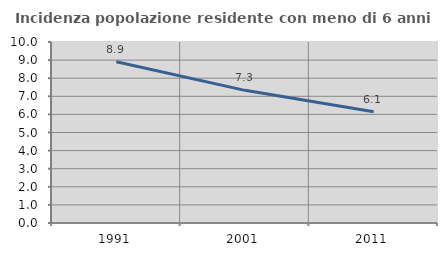
| Category | Incidenza popolazione residente con meno di 6 anni |
|---|---|
| 1991.0 | 8.907 |
| 2001.0 | 7.329 |
| 2011.0 | 6.146 |